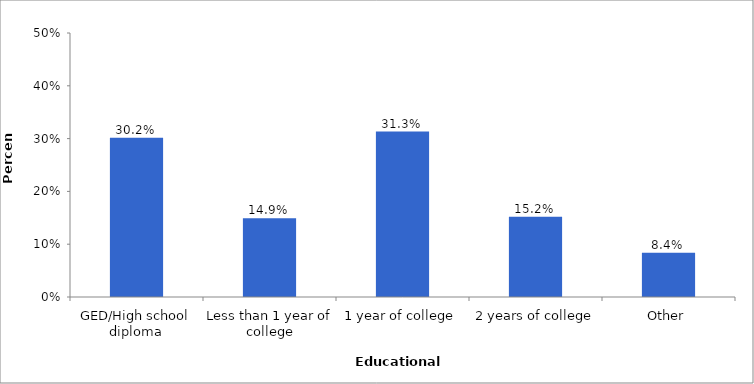
| Category | Series 0 |
|---|---|
| GED/High school diploma | 0.302 |
| Less than 1 year of college | 0.149 |
| 1 year of college | 0.313 |
| 2 years of college | 0.152 |
| Other | 0.084 |